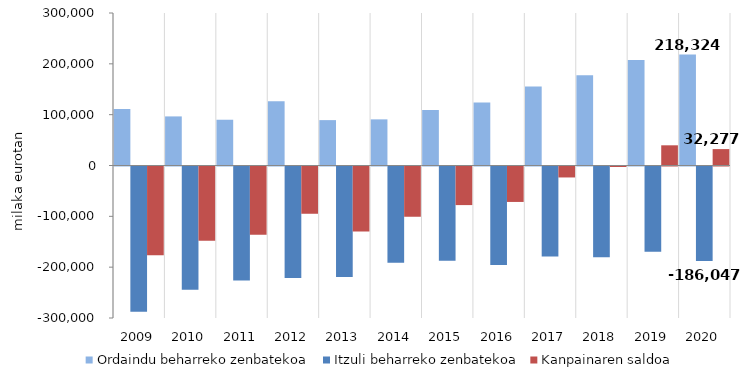
| Category | Ordaindu beharreko zenbatekoa | Itzuli beharreko zenbatekoa | Kanpainaren saldoa  |
|---|---|---|---|
| 2009.0 | 111037.303 | -285706.971 | -174669.668 |
| 2010.0 | 96576.254 | -242527.91 | -145951.656 |
| 2011.0 | 90014.588 | -224438.011 | -134423.423 |
| 2012.0 | 126538.987 | -219516.481 | -92977.494 |
| 2013.0 | 89274.189 | -217318.717 | -128044.528 |
| 2014.0 | 90756.111 | -189377.902 | -98621.791 |
| 2015.0 | 109397.392 | -185305.11 | -75907.718 |
| 2016.0 | 124091.908 | -193818.822 | -69726.914 |
| 2017.0 | 155476 | -177028 | -21552 |
| 2018.0 | 177646 | -178609 | -963 |
| 2019.0 | 207449 | -167723 | 39726 |
| 2020.0 | 218324 | -186047 | 32277 |